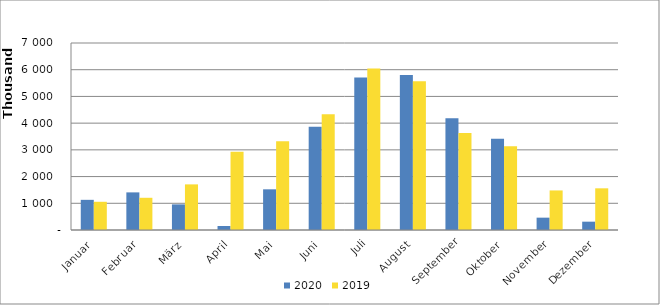
| Category | 2020 | 2019 |
|---|---|---|
| Januar | 1129233 | 1056116 |
| Februar | 1408128 | 1205647 |
| März | 958998 | 1707674 |
| April | 148793 | 2926173 |
| Mai | 1522840 | 3318785 |
| Juni | 3867643 | 4335688 |
| Juli | 5709434 | 6044743 |
| August | 5802579 | 5567222 |
| September | 4183912 | 3633060 |
| Oktober | 3419058 | 3138683 |
| November | 461976 | 1480784 |
| Dezember | 311727 | 1560219 |